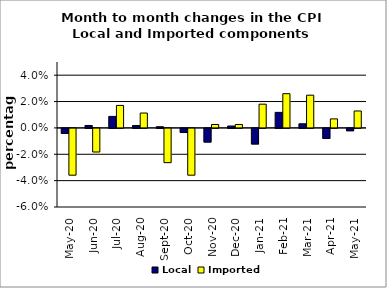
| Category | Local | Imported |
|---|---|---|
| 2020-05-01 | -0.004 | -0.035 |
| 2020-06-01 | 0.002 | -0.018 |
| 2020-07-01 | 0.009 | 0.017 |
| 2020-08-01 | 0.002 | 0.011 |
| 2020-09-01 | 0.001 | -0.026 |
| 2020-10-01 | -0.003 | -0.035 |
| 2020-11-01 | -0.01 | 0.003 |
| 2020-12-01 | 0.001 | 0.003 |
| 2021-01-01 | -0.012 | 0.018 |
| 2021-02-01 | 0.012 | 0.026 |
| 2021-03-01 | 0.003 | 0.025 |
| 2021-04-01 | -0.008 | 0.007 |
| 2021-05-01 | -0.002 | 0.013 |